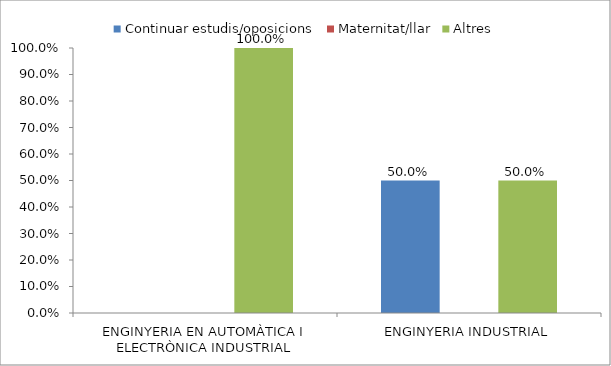
| Category | Continuar estudis/oposicions | Maternitat/llar | Altres |
|---|---|---|---|
| ENGINYERIA EN AUTOMÀTICA I ELECTRÒNICA INDUSTRIAL | 0 | 0 | 1 |
| ENGINYERIA INDUSTRIAL | 0.5 | 0 | 0.5 |